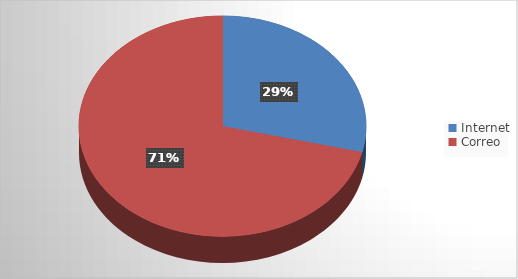
| Category | Series 0 |
|---|---|
| Internet | 19 |
| Correo | 47 |